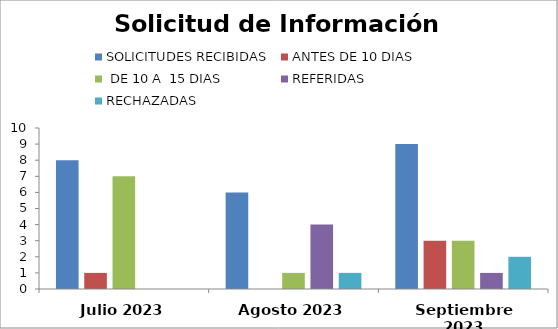
| Category | SOLICITUDES RECIBIDAS | ANTES DE 10 DIAS |  DE 10 A  15 DIAS  | REFERIDAS | RECHAZADAS |
|---|---|---|---|---|---|
| Julio 2023 | 8 | 1 | 7 | 0 | 0 |
| Agosto 2023 | 6 | 0 | 1 | 4 | 1 |
| Septiembre 2023 | 9 | 3 | 3 | 1 | 2 |